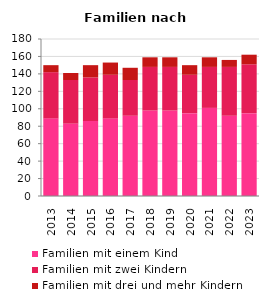
| Category | Familien mit einem Kind | Familien mit zwei Kindern | Familien mit drei und mehr Kindern |
|---|---|---|---|
| 2013.0 | 89 | 53 | 8 |
| 2014.0 | 83 | 50 | 8 |
| 2015.0 | 86 | 50 | 14 |
| 2016.0 | 89 | 50 | 14 |
| 2017.0 | 92 | 41 | 14 |
| 2018.0 | 98 | 50 | 11 |
| 2019.0 | 98 | 50 | 11 |
| 2020.0 | 95 | 44 | 11 |
| 2021.0 | 101 | 47 | 11 |
| 2022.0 | 92 | 56 | 8 |
| 2023.0 | 95 | 56 | 11 |